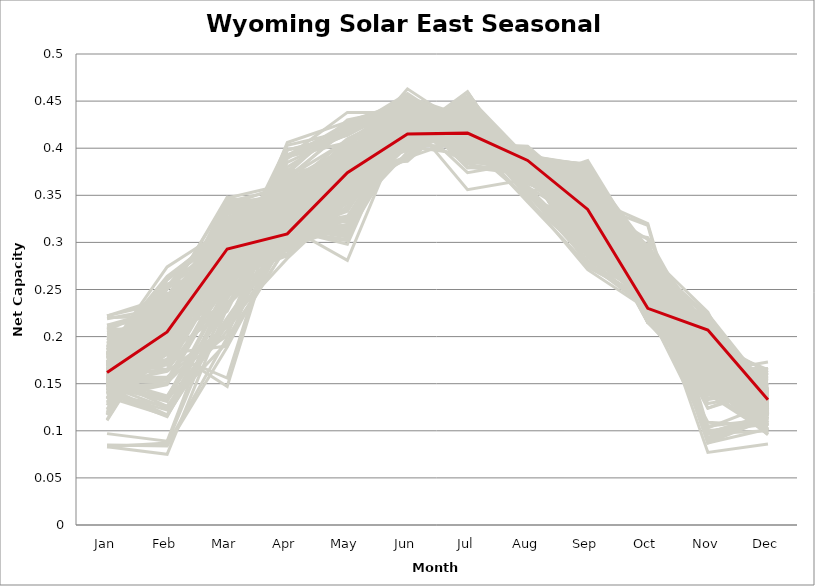
| Category | sample_001 | sample_002 | sample_003 | sample_004 | sample_005 | sample_006 | sample_007 | sample_008 | sample_009 | sample_010 | sample_011 | sample_012 | sample_013 | sample_014 | sample_015 | sample_016 | sample_017 | sample_018 | sample_019 | sample_020 | sample_021 | sample_022 | sample_023 | sample_024 | sample_025 | sample_026 | sample_027 | sample_028 | sample_029 | sample_030 | sample_031 | sample_032 | sample_033 | sample_034 | sample_035 | sample_036 | sample_037 | sample_038 | sample_039 | sample_040 | sample_041 | sample_042 | sample_043 | sample_044 | sample_045 | sample_046 | sample_047 | sample_048 | sample_049 | sample_050 | sample_051 | sample_052 | sample_053 | sample_054 | sample_055 | sample_056 | sample_057 | sample_058 | sample_059 | sample_060 | sample_061 | sample_062 | sample_063 | sample_064 | sample_065 | sample_066 | sample_067 | sample_068 | sample_069 | sample_070 | sample_071 | sample_072 | sample_073 | sample_074 | sample_075 | sample_076 | sample_077 | sample_078 | sample_079 | sample_080 | sample_081 | sample_082 | sample_083 | sample_084 | sample_085 | sample_086 | sample_087 | sample_088 | sample_089 | sample_090 | sample_091 | sample_092 | sample_093 | sample_094 | sample_095 | sample_096 | sample_097 | sample_098 | sample_099 | sample_100 | sample_101 | sample_102 | sample_103 | sample_104 | sample_105 | sample_106 | sample_107 | sample_108 | sample_109 | sample_110 | sample_111 | sample_112 | sample_113 | sample_114 | sample_115 | sample_116 | sample_117 | sample_118 | sample_119 | sample_120 | sample_121 | sample_122 | sample_123 | sample_124 | sample_125 | sample_126 | sample_127 | sample_128 | sample_129 | sample_130 | sample_131 | sample_132 | sample_133 | sample_134 | sample_135 | sample_136 | sample_137 | sample_138 | sample_139 | sample_140 | sample_141 | sample_142 | sample_143 | sample_144 | sample_146 | sample_147 | sample_148 | sample_149 | sample_150 | sample_151 | sample_152 | sample_153 | sample_154 | sample_155 | sample_156 | sample_157 | sample_158 | sample_159 | sample_160 | sample_161 | sample_162 | sample_163 | sample_164 | sample_165 | sample_166 | sample_167 | sample_168 | sample_169 | sample_170 | sample_171 | sample_172 | sample_173 | sample_174 | sample_175 | sample_176 | sample_177 | sample_178 | sample_179 | sample_180 | sample_181 | sample_182 | sample_183 | sample_184 | sample_185 | sample_186 | sample_187 | sample_188 | sample_189 | sample_190 | sample_191 | sample_192 | sample_193 | sample_194 | sample_195 | sample_196 | sample_197 | sample_198 | sample_199 | sample_200 | sample_201 | sample_202 | sample_203 | sample_204 | sample_205 | sample_206 | sample_207 | sample_208 | sample_209 | sample_210 | sample_211 | sample_212 | sample_213 | sample_214 | sample_215 | sample_216 | sample_217 | sample_218 | sample_219 | sample_220 | sample_221 | sample_222 | sample_223 | sample_224 | sample_225 | sample_226 | sample_227 | sample_228 | sample_229 | sample_230 | sample_231 | sample_232 | sample_233 | sample_234 | sample_235 | sample_236 | sample_237 | sample_238 | sample_239 | sample_240 | sample_241 | sample_242 | sample_243 | sample_244 | sample_245 | sample_246 | sample_247 | sample_248 | sample_249 | sample_250 | sample_145 |
|---|---|---|---|---|---|---|---|---|---|---|---|---|---|---|---|---|---|---|---|---|---|---|---|---|---|---|---|---|---|---|---|---|---|---|---|---|---|---|---|---|---|---|---|---|---|---|---|---|---|---|---|---|---|---|---|---|---|---|---|---|---|---|---|---|---|---|---|---|---|---|---|---|---|---|---|---|---|---|---|---|---|---|---|---|---|---|---|---|---|---|---|---|---|---|---|---|---|---|---|---|---|---|---|---|---|---|---|---|---|---|---|---|---|---|---|---|---|---|---|---|---|---|---|---|---|---|---|---|---|---|---|---|---|---|---|---|---|---|---|---|---|---|---|---|---|---|---|---|---|---|---|---|---|---|---|---|---|---|---|---|---|---|---|---|---|---|---|---|---|---|---|---|---|---|---|---|---|---|---|---|---|---|---|---|---|---|---|---|---|---|---|---|---|---|---|---|---|---|---|---|---|---|---|---|---|---|---|---|---|---|---|---|---|---|---|---|---|---|---|---|---|---|---|---|---|---|---|---|---|---|---|---|---|---|---|---|---|---|---|---|---|---|---|---|---|---|---|---|---|---|
| Jan | 0.12 | 0.171 | 0.178 | 0.196 | 0.177 | 0.189 | 0.152 | 0.201 | 0.161 | 0.146 | 0.173 | 0.161 | 0.159 | 0.181 | 0.205 | 0.165 | 0.141 | 0.189 | 0.198 | 0.16 | 0.151 | 0.146 | 0.161 | 0.175 | 0.166 | 0.143 | 0.158 | 0.172 | 0.166 | 0.173 | 0.15 | 0.134 | 0.084 | 0.117 | 0.154 | 0.166 | 0.165 | 0.165 | 0.134 | 0.219 | 0.163 | 0.158 | 0.188 | 0.186 | 0.181 | 0.149 | 0.204 | 0.209 | 0.142 | 0.158 | 0.153 | 0.151 | 0.16 | 0.164 | 0.169 | 0.22 | 0.212 | 0.165 | 0.158 | 0.131 | 0.083 | 0.143 | 0.155 | 0.147 | 0.164 | 0.111 | 0.153 | 0.173 | 0.147 | 0.169 | 0.139 | 0.161 | 0.156 | 0.151 | 0.17 | 0.182 | 0.155 | 0.16 | 0.159 | 0.14 | 0.193 | 0.149 | 0.193 | 0.2 | 0.155 | 0.168 | 0.155 | 0.191 | 0.134 | 0.151 | 0.154 | 0.154 | 0.165 | 0.151 | 0.171 | 0.165 | 0.19 | 0.148 | 0.171 | 0.162 | 0.139 | 0.155 | 0.168 | 0.145 | 0.159 | 0.16 | 0.146 | 0.163 | 0.085 | 0.222 | 0.158 | 0.194 | 0.212 | 0.2 | 0.184 | 0.147 | 0.129 | 0.157 | 0.14 | 0.112 | 0.169 | 0.161 | 0.183 | 0.158 | 0.161 | 0.163 | 0.157 | 0.152 | 0.142 | 0.153 | 0.202 | 0.146 | 0.15 | 0.172 | 0.158 | 0.152 | 0.154 | 0.14 | 0.14 | 0.147 | 0.157 | 0.139 | 0.167 | 0.209 | 0.163 | 0.173 | 0.123 | 0.186 | 0.147 | 0.168 | 0.149 | 0.176 | 0.134 | 0.199 | 0.156 | 0.122 | 0.154 | 0.173 | 0.179 | 0.146 | 0.222 | 0.16 | 0.157 | 0.153 | 0.16 | 0.153 | 0.163 | 0.171 | 0.207 | 0.14 | 0.161 | 0.148 | 0.152 | 0.152 | 0.14 | 0.177 | 0.17 | 0.156 | 0.156 | 0.157 | 0.155 | 0.161 | 0.117 | 0.176 | 0.157 | 0.15 | 0.185 | 0.169 | 0.16 | 0.136 | 0.15 | 0.154 | 0.13 | 0.164 | 0.154 | 0.18 | 0.161 | 0.15 | 0.173 | 0.145 | 0.097 | 0.153 | 0.186 | 0.173 | 0.156 | 0.127 | 0.182 | 0.186 | 0.151 | 0.179 | 0.157 | 0.157 | 0.148 | 0.169 | 0.135 | 0.135 | 0.083 | 0.155 | 0.163 | 0.189 | 0.17 | 0.143 | 0.168 | 0.164 | 0.156 | 0.117 | 0.178 | 0.161 | 0.155 | 0.177 | 0.148 | 0.15 | 0.148 | 0.162 | 0.146 | 0.165 | 0.182 | 0.14 | 0.203 | 0.204 | 0.119 | 0.182 | 0.151 | 0.136 | 0.155 | 0.187 | 0.18 | 0.171 | 0.178 | 0.162 |
| Feb | 0.185 | 0.242 | 0.23 | 0.235 | 0.25 | 0.232 | 0.203 | 0.202 | 0.232 | 0.133 | 0.218 | 0.218 | 0.217 | 0.246 | 0.218 | 0.232 | 0.15 | 0.208 | 0.195 | 0.211 | 0.213 | 0.192 | 0.233 | 0.206 | 0.21 | 0.221 | 0.231 | 0.235 | 0.24 | 0.207 | 0.198 | 0.184 | 0.085 | 0.21 | 0.211 | 0.222 | 0.22 | 0.232 | 0.189 | 0.231 | 0.226 | 0.217 | 0.234 | 0.264 | 0.233 | 0.191 | 0.217 | 0.204 | 0.116 | 0.203 | 0.207 | 0.199 | 0.218 | 0.244 | 0.253 | 0.222 | 0.23 | 0.223 | 0.216 | 0.182 | 0.075 | 0.224 | 0.205 | 0.206 | 0.174 | 0.212 | 0.151 | 0.26 | 0.231 | 0.24 | 0.2 | 0.195 | 0.232 | 0.135 | 0.222 | 0.23 | 0.137 | 0.23 | 0.223 | 0.191 | 0.224 | 0.21 | 0.231 | 0.198 | 0.211 | 0.228 | 0.126 | 0.226 | 0.228 | 0.187 | 0.22 | 0.209 | 0.224 | 0.21 | 0.241 | 0.23 | 0.21 | 0.131 | 0.236 | 0.204 | 0.126 | 0.155 | 0.207 | 0.187 | 0.239 | 0.23 | 0.181 | 0.208 | 0.084 | 0.242 | 0.176 | 0.202 | 0.22 | 0.193 | 0.202 | 0.204 | 0.172 | 0.221 | 0.199 | 0.213 | 0.204 | 0.198 | 0.274 | 0.224 | 0.218 | 0.22 | 0.22 | 0.201 | 0.203 | 0.227 | 0.209 | 0.117 | 0.163 | 0.22 | 0.232 | 0.182 | 0.197 | 0.183 | 0.186 | 0.234 | 0.205 | 0.209 | 0.222 | 0.231 | 0.164 | 0.233 | 0.214 | 0.254 | 0.183 | 0.233 | 0.2 | 0.234 | 0.208 | 0.233 | 0.157 | 0.188 | 0.207 | 0.228 | 0.227 | 0.225 | 0.237 | 0.209 | 0.235 | 0.197 | 0.229 | 0.207 | 0.23 | 0.231 | 0.234 | 0.115 | 0.198 | 0.214 | 0.195 | 0.208 | 0.122 | 0.222 | 0.218 | 0.219 | 0.194 | 0.204 | 0.218 | 0.209 | 0.214 | 0.17 | 0.218 | 0.204 | 0.202 | 0.219 | 0.216 | 0.149 | 0.154 | 0.217 | 0.188 | 0.253 | 0.211 | 0.261 | 0.233 | 0.188 | 0.165 | 0.197 | 0.089 | 0.208 | 0.221 | 0.255 | 0.216 | 0.222 | 0.208 | 0.24 | 0.213 | 0.201 | 0.203 | 0.165 | 0.207 | 0.222 | 0.214 | 0.185 | 0.087 | 0.203 | 0.17 | 0.256 | 0.232 | 0.233 | 0.223 | 0.231 | 0.22 | 0.217 | 0.221 | 0.24 | 0.171 | 0.183 | 0.124 | 0.133 | 0.207 | 0.224 | 0.15 | 0.234 | 0.253 | 0.192 | 0.196 | 0.2 | 0.227 | 0.262 | 0.195 | 0.116 | 0.184 | 0.214 | 0.243 | 0.239 | 0.223 | 0.205 |
| Mar | 0.306 | 0.345 | 0.265 | 0.301 | 0.309 | 0.279 | 0.275 | 0.283 | 0.31 | 0.206 | 0.279 | 0.291 | 0.301 | 0.243 | 0.296 | 0.259 | 0.262 | 0.313 | 0.273 | 0.245 | 0.298 | 0.287 | 0.253 | 0.28 | 0.268 | 0.317 | 0.266 | 0.31 | 0.259 | 0.252 | 0.296 | 0.325 | 0.199 | 0.281 | 0.336 | 0.294 | 0.262 | 0.256 | 0.309 | 0.282 | 0.257 | 0.296 | 0.32 | 0.312 | 0.273 | 0.28 | 0.295 | 0.274 | 0.219 | 0.334 | 0.296 | 0.283 | 0.326 | 0.305 | 0.327 | 0.299 | 0.301 | 0.27 | 0.311 | 0.321 | 0.231 | 0.287 | 0.276 | 0.249 | 0.293 | 0.275 | 0.214 | 0.308 | 0.296 | 0.295 | 0.288 | 0.29 | 0.264 | 0.254 | 0.345 | 0.283 | 0.236 | 0.301 | 0.312 | 0.294 | 0.299 | 0.291 | 0.315 | 0.281 | 0.334 | 0.319 | 0.22 | 0.315 | 0.297 | 0.336 | 0.278 | 0.291 | 0.271 | 0.265 | 0.305 | 0.258 | 0.279 | 0.252 | 0.295 | 0.325 | 0.194 | 0.201 | 0.246 | 0.343 | 0.276 | 0.249 | 0.267 | 0.333 | 0.189 | 0.302 | 0.288 | 0.275 | 0.276 | 0.276 | 0.293 | 0.295 | 0.321 | 0.244 | 0.331 | 0.271 | 0.254 | 0.325 | 0.315 | 0.336 | 0.28 | 0.254 | 0.274 | 0.318 | 0.288 | 0.303 | 0.298 | 0.216 | 0.21 | 0.286 | 0.255 | 0.19 | 0.276 | 0.156 | 0.291 | 0.314 | 0.326 | 0.318 | 0.257 | 0.299 | 0.254 | 0.277 | 0.283 | 0.273 | 0.279 | 0.252 | 0.278 | 0.25 | 0.306 | 0.304 | 0.212 | 0.253 | 0.282 | 0.263 | 0.273 | 0.291 | 0.284 | 0.292 | 0.271 | 0.333 | 0.253 | 0.339 | 0.249 | 0.272 | 0.292 | 0.231 | 0.322 | 0.307 | 0.338 | 0.311 | 0.243 | 0.268 | 0.247 | 0.331 | 0.32 | 0.265 | 0.309 | 0.33 | 0.291 | 0.273 | 0.258 | 0.339 | 0.295 | 0.26 | 0.33 | 0.261 | 0.269 | 0.229 | 0.147 | 0.327 | 0.263 | 0.315 | 0.258 | 0.285 | 0.245 | 0.29 | 0.256 | 0.341 | 0.267 | 0.29 | 0.276 | 0.293 | 0.294 | 0.313 | 0.282 | 0.287 | 0.323 | 0.274 | 0.293 | 0.257 | 0.326 | 0.324 | 0.24 | 0.279 | 0.276 | 0.265 | 0.276 | 0.285 | 0.261 | 0.277 | 0.272 | 0.276 | 0.263 | 0.298 | 0.279 | 0.227 | 0.212 | 0.233 | 0.23 | 0.268 | 0.268 | 0.279 | 0.306 | 0.289 | 0.285 | 0.276 | 0.28 | 0.316 | 0.347 | 0.25 | 0.264 | 0.267 | 0.283 | 0.348 | 0.275 | 0.293 |
| Apr | 0.358 | 0.344 | 0.398 | 0.309 | 0.369 | 0.322 | 0.292 | 0.356 | 0.319 | 0.303 | 0.391 | 0.307 | 0.312 | 0.391 | 0.346 | 0.332 | 0.286 | 0.308 | 0.346 | 0.369 | 0.344 | 0.295 | 0.337 | 0.323 | 0.314 | 0.354 | 0.31 | 0.341 | 0.339 | 0.393 | 0.334 | 0.355 | 0.296 | 0.304 | 0.335 | 0.305 | 0.32 | 0.33 | 0.356 | 0.344 | 0.315 | 0.357 | 0.296 | 0.333 | 0.403 | 0.293 | 0.351 | 0.348 | 0.309 | 0.335 | 0.299 | 0.293 | 0.352 | 0.362 | 0.327 | 0.345 | 0.348 | 0.367 | 0.341 | 0.346 | 0.332 | 0.34 | 0.301 | 0.358 | 0.303 | 0.305 | 0.283 | 0.338 | 0.343 | 0.361 | 0.315 | 0.314 | 0.32 | 0.313 | 0.323 | 0.391 | 0.3 | 0.369 | 0.324 | 0.329 | 0.322 | 0.337 | 0.309 | 0.349 | 0.354 | 0.339 | 0.31 | 0.302 | 0.299 | 0.35 | 0.297 | 0.302 | 0.323 | 0.319 | 0.362 | 0.369 | 0.327 | 0.32 | 0.376 | 0.332 | 0.297 | 0.356 | 0.38 | 0.358 | 0.302 | 0.307 | 0.294 | 0.337 | 0.309 | 0.347 | 0.315 | 0.343 | 0.353 | 0.351 | 0.307 | 0.346 | 0.356 | 0.306 | 0.357 | 0.304 | 0.385 | 0.336 | 0.337 | 0.342 | 0.317 | 0.331 | 0.375 | 0.331 | 0.31 | 0.306 | 0.347 | 0.31 | 0.354 | 0.315 | 0.31 | 0.351 | 0.296 | 0.358 | 0.328 | 0.293 | 0.338 | 0.351 | 0.314 | 0.351 | 0.335 | 0.315 | 0.307 | 0.389 | 0.291 | 0.342 | 0.307 | 0.406 | 0.348 | 0.321 | 0.356 | 0.329 | 0.363 | 0.321 | 0.336 | 0.332 | 0.337 | 0.31 | 0.364 | 0.352 | 0.351 | 0.362 | 0.332 | 0.323 | 0.343 | 0.324 | 0.334 | 0.347 | 0.351 | 0.329 | 0.324 | 0.316 | 0.398 | 0.331 | 0.326 | 0.31 | 0.334 | 0.341 | 0.304 | 0.345 | 0.294 | 0.352 | 0.302 | 0.315 | 0.36 | 0.292 | 0.294 | 0.373 | 0.353 | 0.335 | 0.322 | 0.341 | 0.336 | 0.288 | 0.316 | 0.34 | 0.334 | 0.351 | 0.323 | 0.346 | 0.365 | 0.298 | 0.31 | 0.314 | 0.318 | 0.313 | 0.336 | 0.303 | 0.341 | 0.315 | 0.348 | 0.352 | 0.331 | 0.286 | 0.31 | 0.392 | 0.372 | 0.345 | 0.311 | 0.366 | 0.362 | 0.302 | 0.317 | 0.361 | 0.314 | 0.356 | 0.308 | 0.294 | 0.376 | 0.307 | 0.293 | 0.312 | 0.368 | 0.335 | 0.353 | 0.35 | 0.308 | 0.336 | 0.362 | 0.328 | 0.295 | 0.334 | 0.317 | 0.334 | 0.391 | 0.309 |
| May | 0.384 | 0.377 | 0.414 | 0.363 | 0.379 | 0.306 | 0.367 | 0.377 | 0.356 | 0.351 | 0.406 | 0.342 | 0.376 | 0.438 | 0.366 | 0.361 | 0.349 | 0.385 | 0.378 | 0.42 | 0.37 | 0.358 | 0.361 | 0.395 | 0.384 | 0.373 | 0.325 | 0.344 | 0.36 | 0.417 | 0.375 | 0.392 | 0.365 | 0.382 | 0.384 | 0.345 | 0.366 | 0.355 | 0.365 | 0.39 | 0.318 | 0.364 | 0.366 | 0.392 | 0.418 | 0.365 | 0.368 | 0.378 | 0.384 | 0.387 | 0.353 | 0.361 | 0.38 | 0.378 | 0.385 | 0.383 | 0.37 | 0.423 | 0.364 | 0.359 | 0.388 | 0.398 | 0.366 | 0.41 | 0.355 | 0.369 | 0.343 | 0.393 | 0.403 | 0.373 | 0.379 | 0.365 | 0.334 | 0.388 | 0.375 | 0.415 | 0.376 | 0.361 | 0.365 | 0.372 | 0.378 | 0.38 | 0.355 | 0.362 | 0.393 | 0.354 | 0.369 | 0.362 | 0.361 | 0.385 | 0.316 | 0.361 | 0.358 | 0.371 | 0.373 | 0.408 | 0.376 | 0.379 | 0.379 | 0.386 | 0.358 | 0.395 | 0.419 | 0.39 | 0.313 | 0.317 | 0.359 | 0.39 | 0.367 | 0.371 | 0.356 | 0.374 | 0.391 | 0.374 | 0.381 | 0.372 | 0.375 | 0.319 | 0.378 | 0.359 | 0.415 | 0.394 | 0.39 | 0.381 | 0.35 | 0.366 | 0.378 | 0.394 | 0.374 | 0.365 | 0.371 | 0.375 | 0.395 | 0.379 | 0.327 | 0.391 | 0.364 | 0.388 | 0.376 | 0.35 | 0.384 | 0.357 | 0.298 | 0.354 | 0.35 | 0.312 | 0.369 | 0.427 | 0.345 | 0.362 | 0.373 | 0.428 | 0.378 | 0.374 | 0.393 | 0.307 | 0.378 | 0.31 | 0.321 | 0.407 | 0.386 | 0.373 | 0.401 | 0.396 | 0.374 | 0.402 | 0.361 | 0.348 | 0.366 | 0.39 | 0.387 | 0.37 | 0.383 | 0.37 | 0.391 | 0.324 | 0.414 | 0.374 | 0.394 | 0.364 | 0.371 | 0.385 | 0.358 | 0.354 | 0.318 | 0.395 | 0.388 | 0.306 | 0.398 | 0.36 | 0.338 | 0.43 | 0.372 | 0.405 | 0.37 | 0.385 | 0.366 | 0.337 | 0.328 | 0.379 | 0.389 | 0.396 | 0.317 | 0.403 | 0.381 | 0.358 | 0.399 | 0.363 | 0.362 | 0.38 | 0.392 | 0.327 | 0.368 | 0.307 | 0.362 | 0.383 | 0.375 | 0.354 | 0.333 | 0.424 | 0.376 | 0.409 | 0.302 | 0.4 | 0.375 | 0.356 | 0.308 | 0.384 | 0.341 | 0.386 | 0.366 | 0.378 | 0.426 | 0.323 | 0.352 | 0.303 | 0.373 | 0.376 | 0.376 | 0.373 | 0.365 | 0.392 | 0.397 | 0.387 | 0.352 | 0.38 | 0.281 | 0.374 | 0.414 | 0.374 |
| Jun | 0.454 | 0.406 | 0.449 | 0.405 | 0.433 | 0.425 | 0.415 | 0.44 | 0.431 | 0.414 | 0.454 | 0.402 | 0.408 | 0.438 | 0.431 | 0.416 | 0.427 | 0.409 | 0.428 | 0.453 | 0.417 | 0.417 | 0.419 | 0.426 | 0.423 | 0.406 | 0.425 | 0.429 | 0.419 | 0.455 | 0.412 | 0.451 | 0.445 | 0.386 | 0.409 | 0.403 | 0.421 | 0.419 | 0.413 | 0.449 | 0.433 | 0.435 | 0.405 | 0.45 | 0.449 | 0.418 | 0.431 | 0.439 | 0.427 | 0.405 | 0.414 | 0.417 | 0.438 | 0.431 | 0.433 | 0.448 | 0.438 | 0.44 | 0.435 | 0.448 | 0.452 | 0.419 | 0.412 | 0.442 | 0.447 | 0.391 | 0.414 | 0.449 | 0.422 | 0.431 | 0.398 | 0.444 | 0.434 | 0.428 | 0.4 | 0.454 | 0.414 | 0.43 | 0.426 | 0.416 | 0.425 | 0.424 | 0.41 | 0.437 | 0.438 | 0.431 | 0.425 | 0.415 | 0.388 | 0.445 | 0.421 | 0.41 | 0.424 | 0.416 | 0.435 | 0.441 | 0.426 | 0.429 | 0.444 | 0.41 | 0.415 | 0.446 | 0.458 | 0.448 | 0.418 | 0.425 | 0.412 | 0.408 | 0.443 | 0.434 | 0.444 | 0.43 | 0.44 | 0.438 | 0.414 | 0.416 | 0.452 | 0.419 | 0.44 | 0.405 | 0.453 | 0.408 | 0.447 | 0.407 | 0.415 | 0.421 | 0.438 | 0.406 | 0.398 | 0.405 | 0.43 | 0.421 | 0.457 | 0.415 | 0.425 | 0.443 | 0.414 | 0.448 | 0.414 | 0.39 | 0.405 | 0.409 | 0.442 | 0.434 | 0.403 | 0.438 | 0.405 | 0.448 | 0.408 | 0.42 | 0.407 | 0.45 | 0.411 | 0.421 | 0.445 | 0.414 | 0.436 | 0.439 | 0.421 | 0.428 | 0.454 | 0.409 | 0.432 | 0.442 | 0.424 | 0.447 | 0.421 | 0.42 | 0.421 | 0.425 | 0.405 | 0.417 | 0.432 | 0.406 | 0.43 | 0.433 | 0.446 | 0.413 | 0.409 | 0.41 | 0.411 | 0.41 | 0.391 | 0.43 | 0.418 | 0.447 | 0.412 | 0.438 | 0.435 | 0.425 | 0.429 | 0.443 | 0.455 | 0.433 | 0.421 | 0.444 | 0.419 | 0.41 | 0.396 | 0.419 | 0.463 | 0.442 | 0.43 | 0.45 | 0.429 | 0.392 | 0.417 | 0.412 | 0.426 | 0.411 | 0.398 | 0.43 | 0.412 | 0.438 | 0.404 | 0.452 | 0.451 | 0.415 | 0.431 | 0.439 | 0.443 | 0.421 | 0.438 | 0.432 | 0.432 | 0.392 | 0.431 | 0.429 | 0.447 | 0.437 | 0.416 | 0.418 | 0.444 | 0.421 | 0.427 | 0.434 | 0.432 | 0.415 | 0.438 | 0.437 | 0.403 | 0.45 | 0.443 | 0.439 | 0.411 | 0.428 | 0.434 | 0.403 | 0.451 | 0.415 |
| Jul | 0.433 | 0.408 | 0.402 | 0.414 | 0.394 | 0.398 | 0.416 | 0.414 | 0.426 | 0.448 | 0.412 | 0.393 | 0.414 | 0.409 | 0.411 | 0.412 | 0.437 | 0.413 | 0.413 | 0.417 | 0.423 | 0.425 | 0.411 | 0.423 | 0.425 | 0.453 | 0.404 | 0.418 | 0.405 | 0.403 | 0.423 | 0.389 | 0.434 | 0.442 | 0.425 | 0.402 | 0.412 | 0.402 | 0.46 | 0.39 | 0.394 | 0.419 | 0.413 | 0.426 | 0.404 | 0.428 | 0.408 | 0.403 | 0.448 | 0.42 | 0.426 | 0.422 | 0.389 | 0.398 | 0.432 | 0.389 | 0.397 | 0.413 | 0.432 | 0.385 | 0.426 | 0.451 | 0.415 | 0.422 | 0.416 | 0.447 | 0.446 | 0.429 | 0.447 | 0.396 | 0.424 | 0.402 | 0.405 | 0.435 | 0.418 | 0.397 | 0.445 | 0.41 | 0.426 | 0.424 | 0.405 | 0.432 | 0.413 | 0.411 | 0.386 | 0.426 | 0.438 | 0.409 | 0.436 | 0.387 | 0.397 | 0.413 | 0.409 | 0.411 | 0.409 | 0.407 | 0.414 | 0.434 | 0.403 | 0.427 | 0.455 | 0.417 | 0.416 | 0.394 | 0.402 | 0.405 | 0.434 | 0.419 | 0.437 | 0.395 | 0.423 | 0.413 | 0.401 | 0.403 | 0.42 | 0.42 | 0.394 | 0.4 | 0.387 | 0.432 | 0.406 | 0.427 | 0.421 | 0.407 | 0.397 | 0.417 | 0.414 | 0.429 | 0.428 | 0.418 | 0.409 | 0.441 | 0.405 | 0.425 | 0.405 | 0.406 | 0.417 | 0.403 | 0.418 | 0.412 | 0.422 | 0.459 | 0.398 | 0.399 | 0.438 | 0.389 | 0.434 | 0.398 | 0.421 | 0.407 | 0.427 | 0.406 | 0.459 | 0.406 | 0.412 | 0.386 | 0.416 | 0.391 | 0.411 | 0.446 | 0.389 | 0.421 | 0.409 | 0.383 | 0.407 | 0.38 | 0.407 | 0.402 | 0.407 | 0.44 | 0.427 | 0.418 | 0.356 | 0.418 | 0.435 | 0.409 | 0.398 | 0.417 | 0.429 | 0.414 | 0.419 | 0.422 | 0.441 | 0.421 | 0.41 | 0.38 | 0.422 | 0.402 | 0.4 | 0.45 | 0.427 | 0.411 | 0.402 | 0.431 | 0.412 | 0.426 | 0.416 | 0.427 | 0.422 | 0.419 | 0.421 | 0.379 | 0.402 | 0.426 | 0.417 | 0.437 | 0.427 | 0.414 | 0.43 | 0.427 | 0.425 | 0.414 | 0.427 | 0.4 | 0.459 | 0.402 | 0.431 | 0.43 | 0.411 | 0.403 | 0.41 | 0.452 | 0.399 | 0.406 | 0.419 | 0.444 | 0.403 | 0.405 | 0.42 | 0.405 | 0.444 | 0.443 | 0.421 | 0.409 | 0.444 | 0.394 | 0.394 | 0.423 | 0.408 | 0.403 | 0.432 | 0.425 | 0.39 | 0.441 | 0.429 | 0.416 | 0.374 | 0.415 | 0.397 | 0.416 |
| Aug | 0.369 | 0.368 | 0.372 | 0.375 | 0.365 | 0.391 | 0.389 | 0.386 | 0.377 | 0.386 | 0.367 | 0.375 | 0.381 | 0.381 | 0.381 | 0.389 | 0.358 | 0.377 | 0.382 | 0.372 | 0.38 | 0.378 | 0.395 | 0.393 | 0.391 | 0.366 | 0.4 | 0.383 | 0.389 | 0.376 | 0.386 | 0.377 | 0.389 | 0.387 | 0.369 | 0.376 | 0.385 | 0.388 | 0.365 | 0.369 | 0.398 | 0.382 | 0.378 | 0.38 | 0.378 | 0.382 | 0.381 | 0.383 | 0.369 | 0.379 | 0.379 | 0.381 | 0.375 | 0.376 | 0.388 | 0.374 | 0.377 | 0.388 | 0.377 | 0.381 | 0.383 | 0.379 | 0.381 | 0.387 | 0.357 | 0.38 | 0.388 | 0.378 | 0.377 | 0.377 | 0.385 | 0.347 | 0.396 | 0.369 | 0.375 | 0.37 | 0.372 | 0.382 | 0.376 | 0.389 | 0.389 | 0.379 | 0.375 | 0.383 | 0.377 | 0.373 | 0.38 | 0.378 | 0.378 | 0.376 | 0.396 | 0.382 | 0.382 | 0.392 | 0.37 | 0.395 | 0.385 | 0.365 | 0.359 | 0.384 | 0.389 | 0.378 | 0.369 | 0.384 | 0.395 | 0.4 | 0.391 | 0.366 | 0.391 | 0.377 | 0.353 | 0.385 | 0.379 | 0.381 | 0.384 | 0.379 | 0.38 | 0.401 | 0.377 | 0.38 | 0.377 | 0.381 | 0.375 | 0.371 | 0.382 | 0.39 | 0.378 | 0.383 | 0.383 | 0.39 | 0.372 | 0.373 | 0.381 | 0.385 | 0.402 | 0.375 | 0.387 | 0.393 | 0.396 | 0.383 | 0.366 | 0.37 | 0.391 | 0.38 | 0.368 | 0.386 | 0.38 | 0.38 | 0.383 | 0.39 | 0.389 | 0.385 | 0.369 | 0.391 | 0.38 | 0.378 | 0.38 | 0.391 | 0.397 | 0.382 | 0.372 | 0.381 | 0.383 | 0.372 | 0.392 | 0.372 | 0.391 | 0.382 | 0.383 | 0.363 | 0.383 | 0.378 | 0.367 | 0.394 | 0.362 | 0.398 | 0.384 | 0.377 | 0.381 | 0.39 | 0.373 | 0.366 | 0.38 | 0.351 | 0.398 | 0.376 | 0.381 | 0.391 | 0.376 | 0.357 | 0.351 | 0.382 | 0.4 | 0.386 | 0.392 | 0.379 | 0.389 | 0.385 | 0.348 | 0.38 | 0.387 | 0.383 | 0.391 | 0.384 | 0.384 | 0.378 | 0.38 | 0.388 | 0.376 | 0.377 | 0.374 | 0.344 | 0.379 | 0.387 | 0.368 | 0.388 | 0.383 | 0.381 | 0.343 | 0.382 | 0.364 | 0.385 | 0.398 | 0.372 | 0.366 | 0.377 | 0.393 | 0.377 | 0.354 | 0.381 | 0.384 | 0.374 | 0.396 | 0.391 | 0.359 | 0.392 | 0.37 | 0.381 | 0.38 | 0.382 | 0.378 | 0.379 | 0.381 | 0.356 | 0.387 | 0.383 | 0.385 | 0.367 | 0.371 | 0.387 |
| Sep | 0.31 | 0.319 | 0.305 | 0.329 | 0.319 | 0.328 | 0.38 | 0.336 | 0.329 | 0.343 | 0.324 | 0.372 | 0.333 | 0.274 | 0.338 | 0.37 | 0.289 | 0.321 | 0.341 | 0.326 | 0.32 | 0.374 | 0.363 | 0.341 | 0.337 | 0.373 | 0.344 | 0.331 | 0.362 | 0.32 | 0.314 | 0.345 | 0.355 | 0.349 | 0.317 | 0.373 | 0.373 | 0.358 | 0.387 | 0.328 | 0.347 | 0.321 | 0.332 | 0.349 | 0.303 | 0.371 | 0.337 | 0.342 | 0.346 | 0.3 | 0.377 | 0.369 | 0.327 | 0.327 | 0.361 | 0.337 | 0.34 | 0.317 | 0.329 | 0.349 | 0.339 | 0.366 | 0.377 | 0.319 | 0.279 | 0.352 | 0.348 | 0.343 | 0.366 | 0.326 | 0.345 | 0.271 | 0.352 | 0.341 | 0.31 | 0.315 | 0.356 | 0.317 | 0.319 | 0.321 | 0.344 | 0.329 | 0.32 | 0.332 | 0.332 | 0.32 | 0.352 | 0.321 | 0.342 | 0.36 | 0.341 | 0.381 | 0.369 | 0.382 | 0.33 | 0.316 | 0.349 | 0.341 | 0.319 | 0.306 | 0.342 | 0.278 | 0.326 | 0.367 | 0.347 | 0.343 | 0.376 | 0.312 | 0.359 | 0.346 | 0.292 | 0.339 | 0.341 | 0.346 | 0.315 | 0.324 | 0.349 | 0.349 | 0.347 | 0.346 | 0.322 | 0.307 | 0.348 | 0.319 | 0.372 | 0.378 | 0.331 | 0.304 | 0.347 | 0.347 | 0.333 | 0.346 | 0.286 | 0.336 | 0.347 | 0.313 | 0.378 | 0.313 | 0.313 | 0.354 | 0.314 | 0.384 | 0.344 | 0.338 | 0.335 | 0.345 | 0.344 | 0.291 | 0.375 | 0.366 | 0.383 | 0.298 | 0.376 | 0.349 | 0.278 | 0.353 | 0.321 | 0.339 | 0.321 | 0.36 | 0.333 | 0.333 | 0.327 | 0.339 | 0.365 | 0.333 | 0.372 | 0.368 | 0.342 | 0.339 | 0.297 | 0.323 | 0.332 | 0.321 | 0.34 | 0.347 | 0.293 | 0.325 | 0.316 | 0.383 | 0.336 | 0.31 | 0.348 | 0.31 | 0.34 | 0.354 | 0.317 | 0.348 | 0.335 | 0.294 | 0.28 | 0.319 | 0.322 | 0.354 | 0.381 | 0.354 | 0.373 | 0.378 | 0.32 | 0.336 | 0.344 | 0.342 | 0.325 | 0.34 | 0.316 | 0.347 | 0.323 | 0.346 | 0.318 | 0.327 | 0.304 | 0.286 | 0.317 | 0.344 | 0.385 | 0.358 | 0.345 | 0.376 | 0.276 | 0.274 | 0.324 | 0.366 | 0.352 | 0.325 | 0.339 | 0.342 | 0.34 | 0.329 | 0.287 | 0.284 | 0.347 | 0.356 | 0.311 | 0.342 | 0.295 | 0.34 | 0.323 | 0.329 | 0.333 | 0.339 | 0.346 | 0.351 | 0.361 | 0.353 | 0.371 | 0.345 | 0.341 | 0.315 | 0.32 | 0.335 |
| Oct | 0.261 | 0.222 | 0.232 | 0.219 | 0.258 | 0.25 | 0.276 | 0.268 | 0.297 | 0.303 | 0.239 | 0.258 | 0.222 | 0.24 | 0.272 | 0.243 | 0.258 | 0.224 | 0.279 | 0.247 | 0.245 | 0.278 | 0.246 | 0.286 | 0.288 | 0.276 | 0.273 | 0.287 | 0.256 | 0.238 | 0.25 | 0.24 | 0.288 | 0.244 | 0.233 | 0.257 | 0.254 | 0.248 | 0.283 | 0.262 | 0.275 | 0.287 | 0.215 | 0.221 | 0.238 | 0.277 | 0.272 | 0.263 | 0.268 | 0.233 | 0.277 | 0.272 | 0.222 | 0.265 | 0.24 | 0.259 | 0.257 | 0.255 | 0.29 | 0.261 | 0.259 | 0.25 | 0.256 | 0.263 | 0.236 | 0.256 | 0.32 | 0.23 | 0.247 | 0.263 | 0.217 | 0.229 | 0.276 | 0.243 | 0.229 | 0.225 | 0.269 | 0.285 | 0.294 | 0.26 | 0.276 | 0.297 | 0.225 | 0.273 | 0.223 | 0.289 | 0.282 | 0.224 | 0.24 | 0.233 | 0.29 | 0.267 | 0.246 | 0.261 | 0.265 | 0.259 | 0.277 | 0.243 | 0.259 | 0.242 | 0.318 | 0.235 | 0.239 | 0.232 | 0.278 | 0.283 | 0.287 | 0.227 | 0.296 | 0.253 | 0.25 | 0.274 | 0.26 | 0.269 | 0.23 | 0.239 | 0.261 | 0.281 | 0.229 | 0.255 | 0.237 | 0.235 | 0.223 | 0.221 | 0.246 | 0.251 | 0.283 | 0.233 | 0.215 | 0.224 | 0.272 | 0.276 | 0.238 | 0.285 | 0.275 | 0.245 | 0.275 | 0.278 | 0.273 | 0.22 | 0.234 | 0.282 | 0.267 | 0.263 | 0.283 | 0.255 | 0.252 | 0.235 | 0.292 | 0.249 | 0.273 | 0.241 | 0.276 | 0.272 | 0.23 | 0.243 | 0.29 | 0.253 | 0.24 | 0.249 | 0.26 | 0.228 | 0.269 | 0.218 | 0.248 | 0.22 | 0.245 | 0.244 | 0.275 | 0.253 | 0.238 | 0.234 | 0.215 | 0.271 | 0.228 | 0.26 | 0.241 | 0.227 | 0.234 | 0.258 | 0.24 | 0.23 | 0.251 | 0.281 | 0.297 | 0.215 | 0.23 | 0.265 | 0.216 | 0.265 | 0.253 | 0.254 | 0.276 | 0.236 | 0.255 | 0.235 | 0.25 | 0.294 | 0.289 | 0.243 | 0.256 | 0.226 | 0.247 | 0.223 | 0.294 | 0.247 | 0.226 | 0.28 | 0.305 | 0.223 | 0.233 | 0.257 | 0.244 | 0.266 | 0.277 | 0.254 | 0.265 | 0.282 | 0.248 | 0.239 | 0.27 | 0.252 | 0.273 | 0.264 | 0.277 | 0.261 | 0.254 | 0.26 | 0.249 | 0.23 | 0.29 | 0.273 | 0.265 | 0.287 | 0.267 | 0.267 | 0.265 | 0.256 | 0.263 | 0.268 | 0.25 | 0.232 | 0.231 | 0.226 | 0.293 | 0.28 | 0.259 | 0.225 | 0.226 | 0.23 |
| Nov | 0.077 | 0.17 | 0.167 | 0.206 | 0.156 | 0.153 | 0.165 | 0.191 | 0.192 | 0.098 | 0.191 | 0.171 | 0.211 | 0.173 | 0.211 | 0.142 | 0.197 | 0.188 | 0.197 | 0.19 | 0.161 | 0.177 | 0.124 | 0.207 | 0.209 | 0.185 | 0.168 | 0.181 | 0.134 | 0.176 | 0.173 | 0.173 | 0.226 | 0.214 | 0.164 | 0.18 | 0.148 | 0.133 | 0.181 | 0.17 | 0.155 | 0.169 | 0.212 | 0.172 | 0.179 | 0.173 | 0.205 | 0.185 | 0.087 | 0.17 | 0.184 | 0.172 | 0.161 | 0.164 | 0.175 | 0.177 | 0.196 | 0.208 | 0.186 | 0.18 | 0.154 | 0.169 | 0.171 | 0.2 | 0.17 | 0.21 | 0.103 | 0.164 | 0.17 | 0.16 | 0.21 | 0.156 | 0.16 | 0.097 | 0.179 | 0.188 | 0.098 | 0.173 | 0.193 | 0.174 | 0.213 | 0.187 | 0.201 | 0.196 | 0.143 | 0.185 | 0.091 | 0.202 | 0.224 | 0.162 | 0.162 | 0.173 | 0.154 | 0.158 | 0.166 | 0.205 | 0.206 | 0.105 | 0.15 | 0.167 | 0.089 | 0.147 | 0.178 | 0.164 | 0.171 | 0.166 | 0.183 | 0.166 | 0.208 | 0.192 | 0.182 | 0.205 | 0.174 | 0.193 | 0.183 | 0.158 | 0.178 | 0.16 | 0.178 | 0.207 | 0.178 | 0.158 | 0.175 | 0.159 | 0.173 | 0.134 | 0.152 | 0.167 | 0.217 | 0.213 | 0.205 | 0.087 | 0.153 | 0.218 | 0.159 | 0.148 | 0.167 | 0.141 | 0.178 | 0.224 | 0.159 | 0.191 | 0.158 | 0.201 | 0.179 | 0.155 | 0.218 | 0.172 | 0.185 | 0.138 | 0.165 | 0.167 | 0.179 | 0.222 | 0.146 | 0.182 | 0.163 | 0.148 | 0.138 | 0.162 | 0.166 | 0.209 | 0.144 | 0.152 | 0.129 | 0.157 | 0.124 | 0.139 | 0.214 | 0.097 | 0.171 | 0.167 | 0.151 | 0.193 | 0.1 | 0.151 | 0.159 | 0.171 | 0.165 | 0.162 | 0.175 | 0.161 | 0.221 | 0.14 | 0.161 | 0.158 | 0.19 | 0.153 | 0.144 | 0.201 | 0.191 | 0.197 | 0.156 | 0.173 | 0.153 | 0.168 | 0.143 | 0.184 | 0.146 | 0.171 | 0.159 | 0.146 | 0.147 | 0.149 | 0.155 | 0.217 | 0.189 | 0.223 | 0.191 | 0.192 | 0.159 | 0.182 | 0.159 | 0.146 | 0.198 | 0.169 | 0.163 | 0.188 | 0.178 | 0.169 | 0.139 | 0.172 | 0.152 | 0.143 | 0.151 | 0.218 | 0.146 | 0.155 | 0.18 | 0.159 | 0.09 | 0.093 | 0.192 | 0.168 | 0.199 | 0.165 | 0.166 | 0.169 | 0.191 | 0.188 | 0.213 | 0.168 | 0.167 | 0.109 | 0.185 | 0.209 | 0.165 | 0.177 | 0.185 | 0.207 |
| Dec | 0.086 | 0.134 | 0.13 | 0.148 | 0.101 | 0.157 | 0.128 | 0.121 | 0.129 | 0.117 | 0.14 | 0.136 | 0.133 | 0.119 | 0.126 | 0.142 | 0.141 | 0.134 | 0.113 | 0.135 | 0.143 | 0.127 | 0.148 | 0.116 | 0.117 | 0.159 | 0.157 | 0.117 | 0.145 | 0.134 | 0.141 | 0.124 | 0.1 | 0.126 | 0.118 | 0.141 | 0.138 | 0.144 | 0.159 | 0.124 | 0.154 | 0.106 | 0.142 | 0.164 | 0.137 | 0.128 | 0.119 | 0.122 | 0.102 | 0.132 | 0.133 | 0.127 | 0.139 | 0.102 | 0.148 | 0.128 | 0.131 | 0.142 | 0.113 | 0.133 | 0.111 | 0.14 | 0.13 | 0.143 | 0.145 | 0.136 | 0.128 | 0.156 | 0.139 | 0.108 | 0.131 | 0.144 | 0.152 | 0.111 | 0.144 | 0.136 | 0.116 | 0.106 | 0.123 | 0.14 | 0.117 | 0.115 | 0.141 | 0.123 | 0.135 | 0.12 | 0.115 | 0.14 | 0.136 | 0.123 | 0.173 | 0.13 | 0.14 | 0.127 | 0.105 | 0.149 | 0.118 | 0.112 | 0.098 | 0.132 | 0.114 | 0.121 | 0.133 | 0.124 | 0.164 | 0.166 | 0.124 | 0.115 | 0.109 | 0.137 | 0.143 | 0.12 | 0.123 | 0.118 | 0.129 | 0.144 | 0.126 | 0.162 | 0.122 | 0.13 | 0.133 | 0.123 | 0.16 | 0.131 | 0.137 | 0.141 | 0.098 | 0.139 | 0.13 | 0.14 | 0.118 | 0.113 | 0.116 | 0.121 | 0.157 | 0.13 | 0.126 | 0.116 | 0.137 | 0.144 | 0.112 | 0.165 | 0.157 | 0.134 | 0.118 | 0.155 | 0.134 | 0.13 | 0.131 | 0.147 | 0.125 | 0.124 | 0.155 | 0.123 | 0.123 | 0.137 | 0.098 | 0.155 | 0.156 | 0.14 | 0.129 | 0.134 | 0.096 | 0.131 | 0.14 | 0.131 | 0.144 | 0.149 | 0.126 | 0.1 | 0.13 | 0.146 | 0.128 | 0.14 | 0.107 | 0.151 | 0.127 | 0.142 | 0.134 | 0.129 | 0.145 | 0.117 | 0.136 | 0.119 | 0.166 | 0.129 | 0.134 | 0.158 | 0.135 | 0.14 | 0.138 | 0.13 | 0.118 | 0.147 | 0.129 | 0.153 | 0.142 | 0.129 | 0.117 | 0.141 | 0.118 | 0.131 | 0.153 | 0.147 | 0.101 | 0.137 | 0.131 | 0.132 | 0.12 | 0.132 | 0.118 | 0.139 | 0.145 | 0.159 | 0.162 | 0.125 | 0.119 | 0.121 | 0.142 | 0.128 | 0.098 | 0.138 | 0.158 | 0.098 | 0.096 | 0.136 | 0.152 | 0.105 | 0.139 | 0.122 | 0.114 | 0.118 | 0.14 | 0.162 | 0.137 | 0.161 | 0.107 | 0.142 | 0.122 | 0.119 | 0.131 | 0.159 | 0.118 | 0.105 | 0.125 | 0.118 | 0.166 | 0.13 | 0.139 | 0.133 |